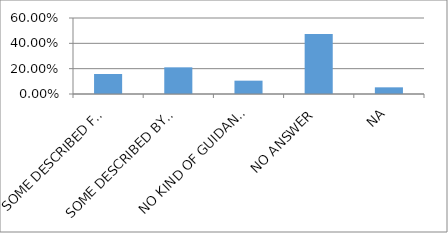
| Category | Series 0 |
|---|---|
| SOME DESCRIBED FOR TGICA | 0.158 |
| SOME DESCRIBED BY OTHER THAN TGICA | 0.211 |
| NO KIND OF GUIDANCE BY TGICA | 0.105 |
| NO ANSWER | 0.474 |
| NA | 0.053 |